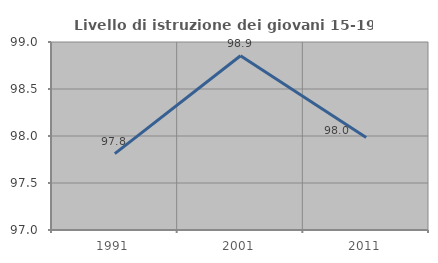
| Category | Livello di istruzione dei giovani 15-19 anni |
|---|---|
| 1991.0 | 97.812 |
| 2001.0 | 98.854 |
| 2011.0 | 97.985 |